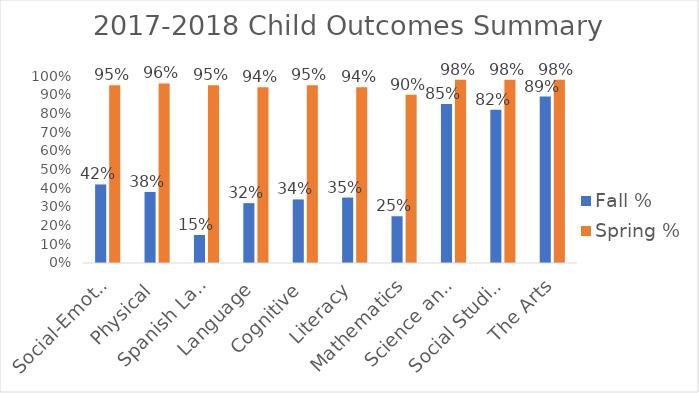
| Category | Fall % | Spring % |
|---|---|---|
| Social-Emotional | 0.42 | 0.95 |
| Physical | 0.38 | 0.96 |
| Spanish Language | 0.15 | 0.95 |
| Language | 0.32 | 0.94 |
| Cognitive | 0.34 | 0.95 |
| Literacy | 0.35 | 0.94 |
| Mathematics | 0.25 | 0.9 |
| Science and Technology | 0.85 | 0.98 |
| Social Studies | 0.82 | 0.98 |
| The Arts | 0.89 | 0.98 |